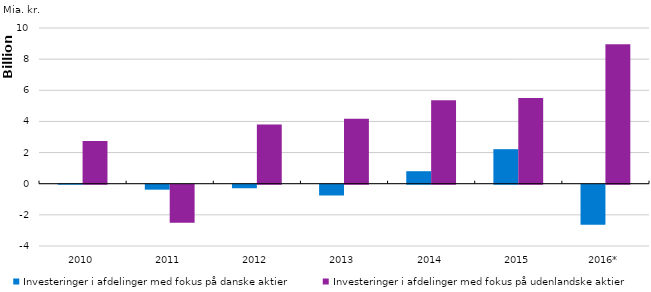
| Category | Investeringer i afdelinger med fokus på danske aktier | Investeringer i afdelinger med fokus på udenlandske aktier |
|---|---|---|
| 2010 | 20308658.37 | 2744870082.49 |
| 2011 | -318790853.71 | -2439930019.17 |
| 2012 | -226167738.05 | 3802510656.34 |
| 2013 | -692485256.96 | 4164392167.7 |
| 2014 | 803058670.35 | 5361077529.74 |
| 2015 | 2217602929.9 | 5504635710.45 |
| 2016* | -2565521536.33 | 8949895834.78 |